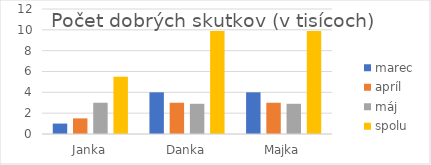
| Category | marec | apríl | máj | spolu |
|---|---|---|---|---|
| Janka | 1 | 1.5 | 3 | 5.5 |
| Danka | 4 | 3 | 2.9 | 9.9 |
| Majka | 4 | 3 | 2.9 | 9.9 |